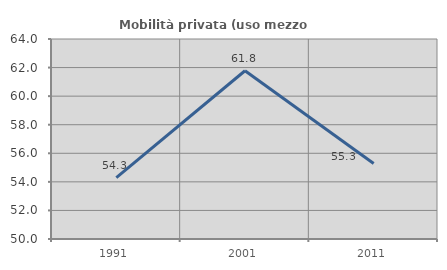
| Category | Mobilità privata (uso mezzo privato) |
|---|---|
| 1991.0 | 54.297 |
| 2001.0 | 61.778 |
| 2011.0 | 55.285 |